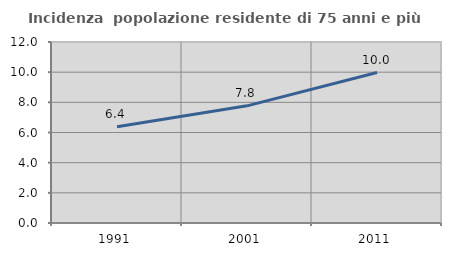
| Category | Incidenza  popolazione residente di 75 anni e più |
|---|---|
| 1991.0 | 6.377 |
| 2001.0 | 7.768 |
| 2011.0 | 9.975 |